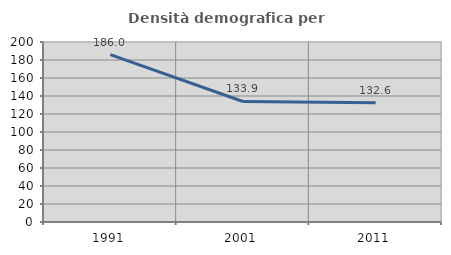
| Category | Densità demografica |
|---|---|
| 1991.0 | 185.955 |
| 2001.0 | 133.919 |
| 2011.0 | 132.571 |